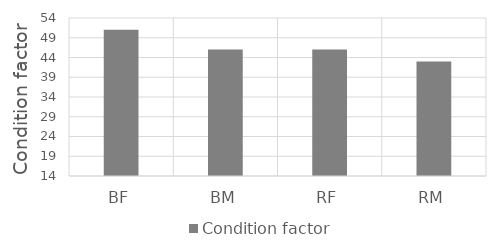
| Category | Condition factor |
|---|---|
| BF | 51 |
| BM | 46 |
| RF | 46 |
| RM | 43 |